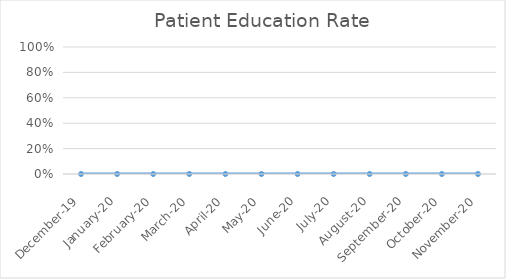
| Category | Series 0 |
|---|---|
| 2019-12-01 | 0 |
| 2020-01-01 | 0 |
| 2020-02-01 | 0 |
| 2020-03-01 | 0 |
| 2020-04-01 | 0 |
| 2020-05-01 | 0 |
| 2020-06-01 | 0 |
| 2020-07-01 | 0 |
| 2020-08-01 | 0 |
| 2020-09-01 | 0 |
| 2020-10-01 | 0 |
| 2020-11-01 | 0 |